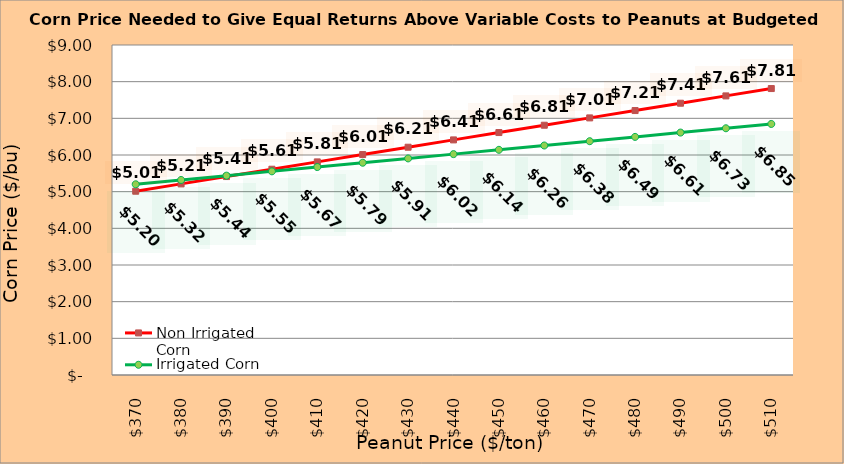
| Category | Non Irrigated Corn | Irrigated Corn |
|---|---|---|
| 370.0 | 5.012 | 5.202 |
| 380.0 | 5.212 | 5.319 |
| 390.0 | 5.412 | 5.437 |
| 400.0 | 5.612 | 5.554 |
| 410.0 | 5.812 | 5.672 |
| 420.0 | 6.012 | 5.789 |
| 430.0 | 6.212 | 5.907 |
| 440.0 | 6.412 | 6.024 |
| 450.0 | 6.612 | 6.142 |
| 460.0 | 6.812 | 6.259 |
| 470.0 | 7.012 | 6.377 |
| 480.0 | 7.212 | 6.494 |
| 490.0 | 7.412 | 6.612 |
| 500.0 | 7.612 | 6.729 |
| 510.0 | 7.812 | 6.847 |